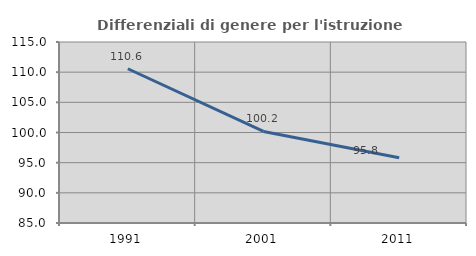
| Category | Differenziali di genere per l'istruzione superiore |
|---|---|
| 1991.0 | 110.568 |
| 2001.0 | 100.178 |
| 2011.0 | 95.799 |